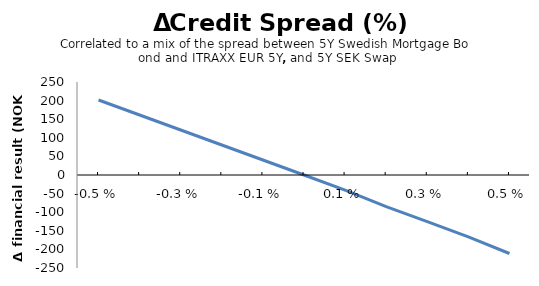
| Category | Series 0 |
|---|---|
| -0.005 | 201.576 |
| -0.004 | 161.26 |
| -0.003 | 120.945 |
| -0.002 | 80.63 |
| -0.001 | 40.315 |
| 0.0 | 0 |
| 0.001 | -40.505 |
| 0.002 | -85.216 |
| 0.003 | -125.575 |
| 0.004 | -166.503 |
| 0.005 | -211.048 |